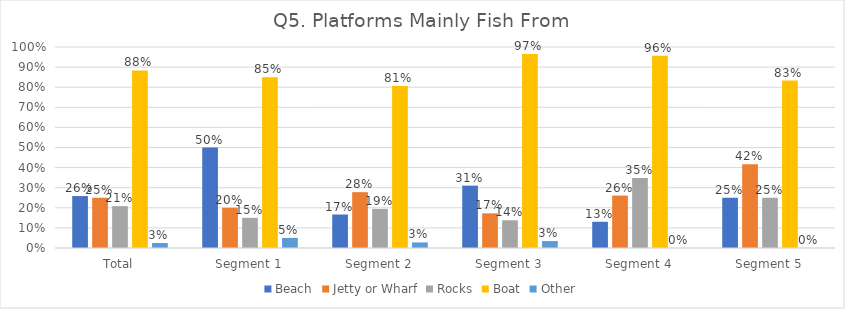
| Category | Beach | Jetty or Wharf | Rocks | Boat | Other |
|---|---|---|---|---|---|
| Total | 0.258 | 0.25 | 0.208 | 0.883 | 0.025 |
| Segment 1 | 0.5 | 0.2 | 0.15 | 0.85 | 0.05 |
| Segment 2 | 0.167 | 0.278 | 0.194 | 0.806 | 0.028 |
| Segment 3 | 0.31 | 0.172 | 0.138 | 0.966 | 0.034 |
| Segment 4 | 0.13 | 0.261 | 0.348 | 0.957 | 0 |
| Segment 5 | 0.25 | 0.417 | 0.25 | 0.833 | 0 |